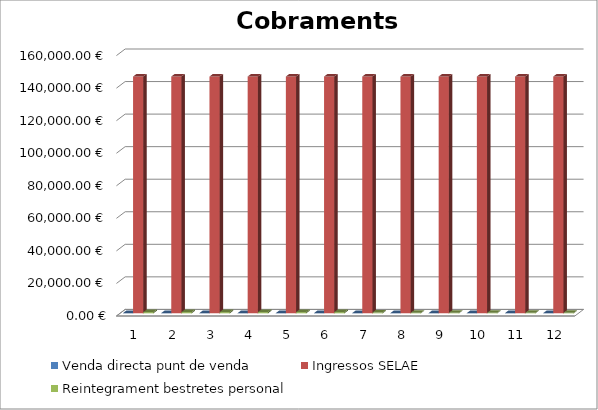
| Category | Venda directa punt de venda | Ingressos SELAE | Reintegrament bestretes personal |
|---|---|---|---|
| 0 | 75 | 145497.02 | 728.75 |
| 1 | 75 | 145497.02 | 728.75 |
| 2 | 75 | 145497.02 | 728.75 |
| 3 | 75 | 145497.02 | 728.75 |
| 4 | 75 | 145497.02 | 728.75 |
| 5 | 75 | 145497.02 | 728.75 |
| 6 | 75 | 145497.02 | 461.75 |
| 7 | 75 | 145497.02 | 295 |
| 8 | 75 | 145497.02 | 295 |
| 9 | 75 | 145497.02 | 295 |
| 10 | 75 | 145497.02 | 295 |
| 11 | 75 | 145497.02 | 295 |